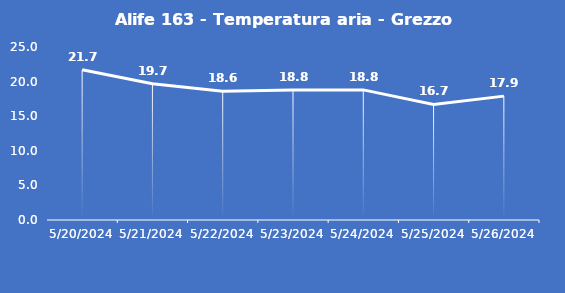
| Category | Alife 163 - Temperatura aria - Grezzo (°C) |
|---|---|
| 5/20/24 | 21.7 |
| 5/21/24 | 19.7 |
| 5/22/24 | 18.6 |
| 5/23/24 | 18.8 |
| 5/24/24 | 18.8 |
| 5/25/24 | 16.7 |
| 5/26/24 | 17.9 |